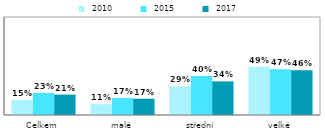
| Category |  2010 |  2015 |  2017 |
|---|---|---|---|
| Celkem | 0.154 | 0.226 | 0.208 |
| malé | 0.11 | 0.174 | 0.166 |
| střední | 0.291 | 0.399 | 0.343 |
| velké | 0.493 | 0.468 | 0.457 |